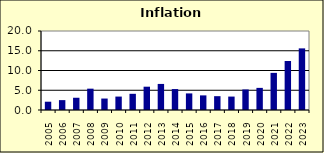
| Category | 1.2 |
|---|---|
| 2005.0 | 2.1 |
| 2006.0 | 2.5 |
| 2007.0 | 3.1 |
| 2008.0 | 5.4 |
| 2009.0 | 2.9 |
| 2010.0 | 3.4 |
| 2011.0 | 4.1 |
| 2012.0 | 5.9 |
| 2013.0 | 6.6 |
| 2014.0 | 5.3 |
| 2015.0 | 4.2 |
| 2016.0 | 3.7 |
| 2017.0 | 3.5 |
| 2018.0 | 3.4 |
| 2019.0 | 5.2 |
| 2020.0 | 5.6 |
| 2021.0 | 9.4 |
| 2022.0 | 12.4 |
| 2023.0 | 15.6 |